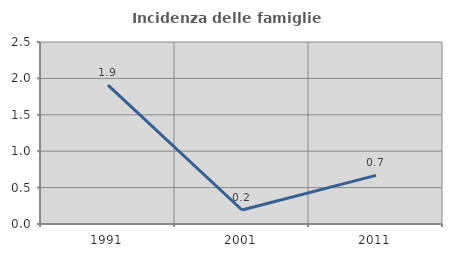
| Category | Incidenza delle famiglie numerose |
|---|---|
| 1991.0 | 1.907 |
| 2001.0 | 0.193 |
| 2011.0 | 0.668 |